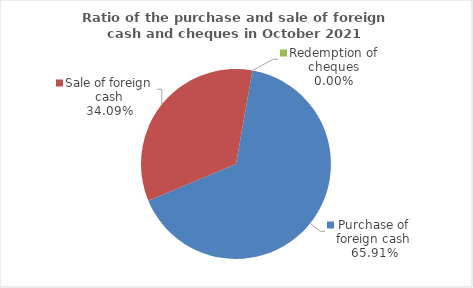
| Category | Series 0 |
|---|---|
| Purchase of foreign cash | 65.914 |
| Sale of foreign cash | 34.086 |
| Redemption of cheques | 0 |